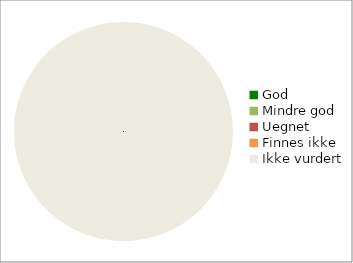
| Category | Series 0 |
|---|---|
| God | 0 |
| Mindre god | 0 |
| Uegnet | 0 |
| Finnes ikke | 0 |
| Ikke vurdert | 161 |